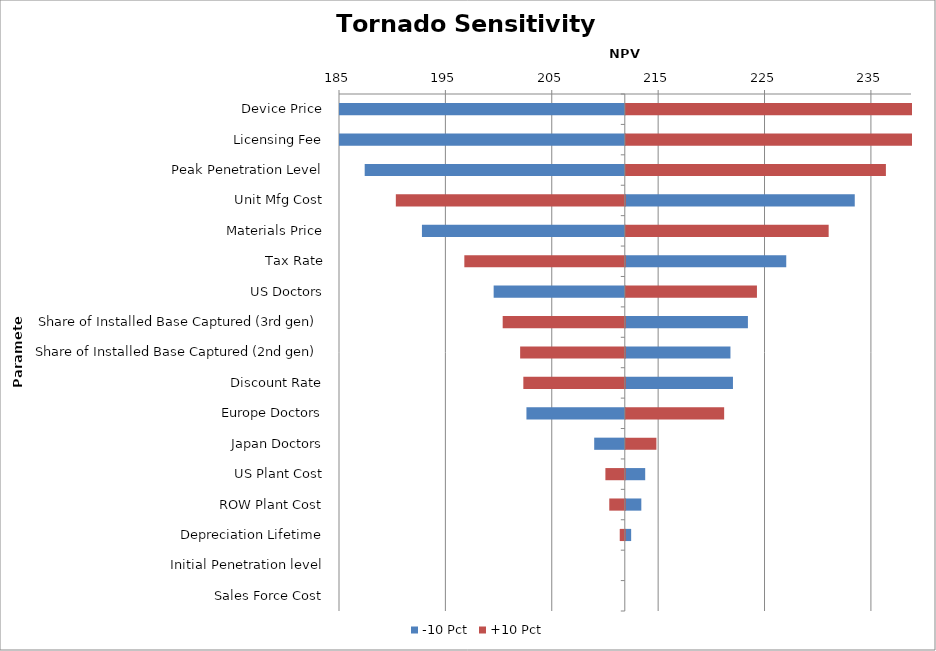
| Category | -10 Pct | +10 Pct |
|---|---|---|
| Device Price | 184.762 | 238.568 |
| Licensing Fee | 184.762 | 238.568 |
| Peak Penetration Level | 187.215 | 236.115 |
| Unit Mfg Cost | 233.188 | 190.143 |
| Materials Price | 192.596 | 230.735 |
| Tax Rate | 226.749 | 196.582 |
| US Doctors | 199.338 | 223.993 |
| Share of Installed Base Captured (3rd gen) | 223.144 | 200.187 |
| Share of Installed Base Captured (2nd gen) | 221.503 | 201.828 |
| Discount Rate | 221.738 | 202.128 |
| Europe Doctors | 202.42 | 220.911 |
| Japan Doctors | 208.789 | 214.542 |
| US Plant Cost | 213.489 | 209.841 |
| ROW Plant Cost | 213.125 | 210.206 |
| Depreciation Lifetime | 212.169 | 211.19 |
| Initial Penetration level | 211.665 | 211.665 |
| Sales Force Cost | 211.665 | 211.665 |